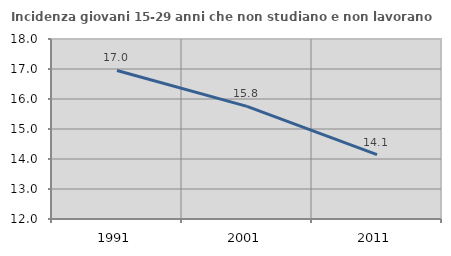
| Category | Incidenza giovani 15-29 anni che non studiano e non lavorano  |
|---|---|
| 1991.0 | 16.952 |
| 2001.0 | 15.756 |
| 2011.0 | 14.148 |